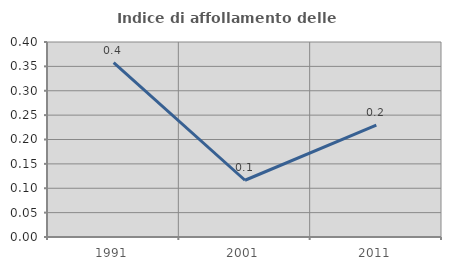
| Category | Indice di affollamento delle abitazioni  |
|---|---|
| 1991.0 | 0.358 |
| 2001.0 | 0.116 |
| 2011.0 | 0.229 |